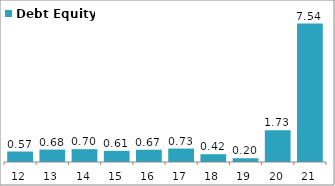
| Category | Debt Equity |
|---|---|
| 2012-03-31 | 0.571 |
| 2013-03-31 | 0.676 |
| 2014-03-31 | 0.698 |
| 2015-03-31 | 0.606 |
| 2016-03-31 | 0.667 |
| 2017-03-31 | 0.732 |
| 2018-03-31 | 0.424 |
| 2019-03-31 | 0.204 |
| 2020-03-31 | 1.728 |
| 2021-03-31 | 7.537 |